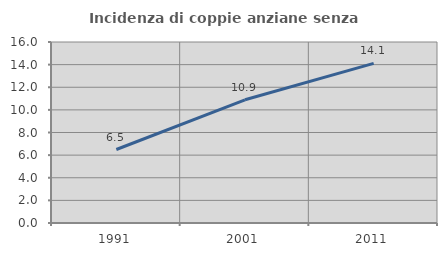
| Category | Incidenza di coppie anziane senza figli  |
|---|---|
| 1991.0 | 6.496 |
| 2001.0 | 10.889 |
| 2011.0 | 14.109 |